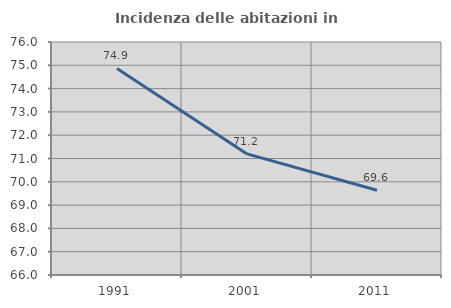
| Category | Incidenza delle abitazioni in proprietà  |
|---|---|
| 1991.0 | 74.866 |
| 2001.0 | 71.198 |
| 2011.0 | 69.636 |